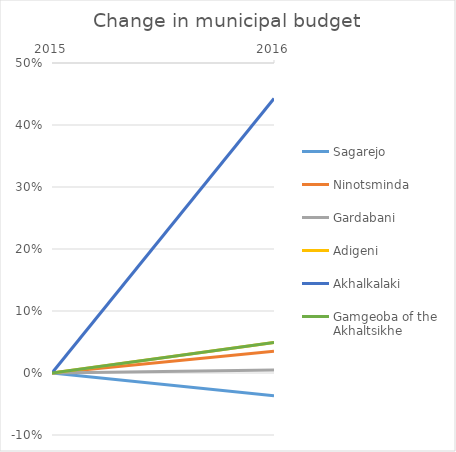
| Category | Sagarejo | Ninotsminda  | Gardabani  | Adigeni  | Akhalkalaki  | Gamgeoba of the Akhaltsikhe  |
|---|---|---|---|---|---|---|
| 2015.0 | 0 | 0 | 0 | 0 | 0 | 0 |
| 2016.0 | -0.037 | 0.035 | 0.005 | 0.049 | 0.443 | 0.049 |